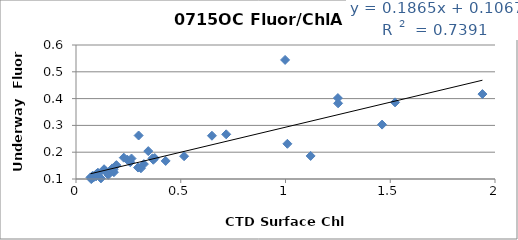
| Category | Series 0 |
|---|---|
| 0.324 | 0.156 |
| 1.009 | 0.231 |
| 0.296 | 0.143 |
| 0.245 | 0.172 |
| 0.173 | 0.14 |
| 0.193 | 0.152 |
| 0.259 | 0.163 |
| 0.154 | 0.116 |
| 0.179 | 0.135 |
| 0.181 | 0.125 |
| 0.119 | 0.102 |
| 0.083 | 0.105 |
| 0.08 | 0.111 |
| 0.082 | 0.11 |
| 0.078 | 0.11 |
| 0.098 | 0.119 |
| 0.088 | 0.11 |
| 0.134 | 0.136 |
| 0.073 | 0.1 |
| 0.069 | 0.106 |
| 0.096 | 0.112 |
| 0.265 | 0.176 |
| 0.31 | 0.14 |
| 0.516 | 0.185 |
| 0.365 | 0.177 |
| 0.428 | 0.167 |
| 0.369 | 0.172 |
| 0.228 | 0.18 |
| 0.345 | 0.204 |
| 0.998 | 0.544 |
| 0.142 | 0.129 |
| 0.649 | 0.261 |
| 0.717 | 0.267 |
| 1.12 | 0.186 |
| 1.94 | 0.417 |
| 1.523 | 0.386 |
| 1.461 | 0.303 |
| 1.25 | 0.402 |
| 0.299 | 0.262 |
| 0.376 | 0.178 |
| 0.187 | 0.148 |
| 1.251 | 0.382 |
| 0.096 | 0.11 |
| 0.108 | 0.121 |
| 0.106 | 0.122 |
| 0.074 | 0.105 |
| 0.103 | 0.122 |